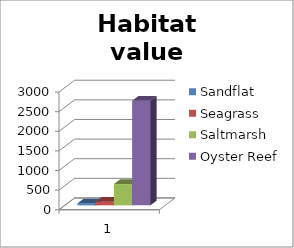
| Category | Sandflat | Seagrass | Saltmarsh | Oyster Reef |
|---|---|---|---|---|
| 0 | 49.133 | 95.089 | 542.429 | 2665.649 |